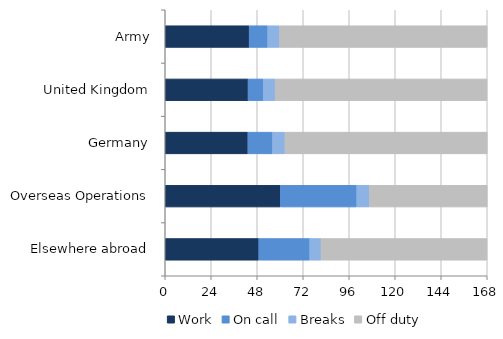
| Category | Work | On call | Breaks | Off duty |
|---|---|---|---|---|
| Army | 43.803 | 9.682 | 6.177 | 108.267 |
| United Kingdom | 43.24 | 7.957 | 6.163 | 110.563 |
| Germany | 43.153 | 12.865 | 6.491 | 105.509 |
| Overseas Operations | 60.05 | 39.889 | 6.614 | 61.459 |
| Elsewhere abroad | 48.833 | 26.573 | 5.927 | 86.58 |